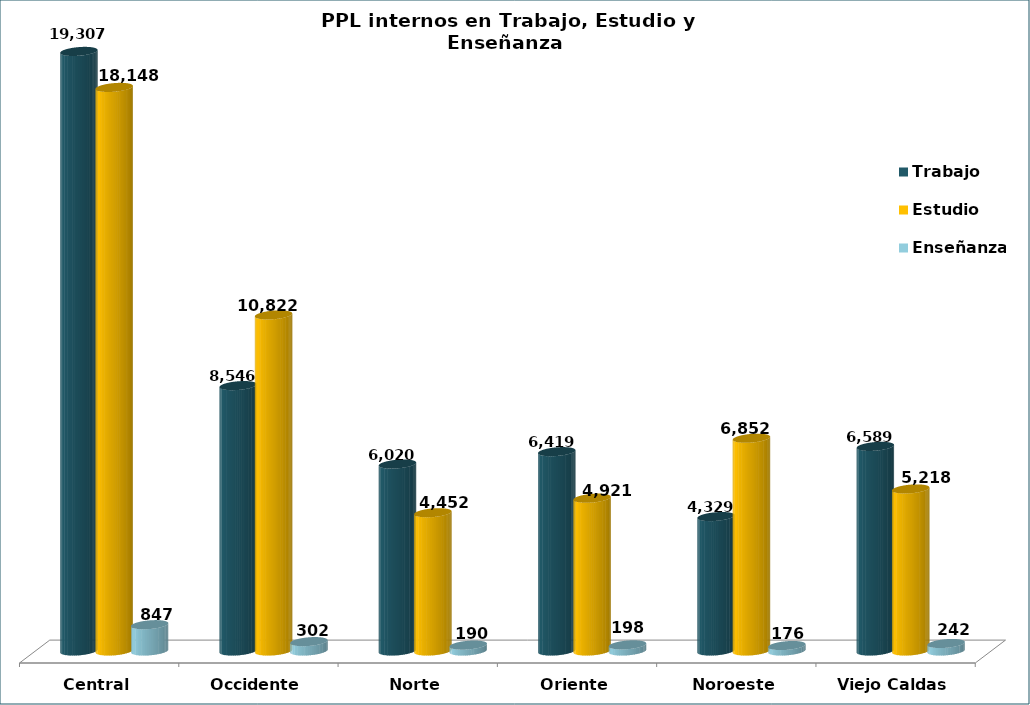
| Category | Trabajo | Estudio | Enseñanza |
|---|---|---|---|
| Central | 19307 | 18148 | 847 |
| Occidente | 8546 | 10822 | 302 |
| Norte | 6020 | 4452 | 190 |
| Oriente | 6419 | 4921 | 198 |
| Noroeste | 4329 | 6852 | 176 |
| Viejo Caldas | 6589 | 5218 | 242 |